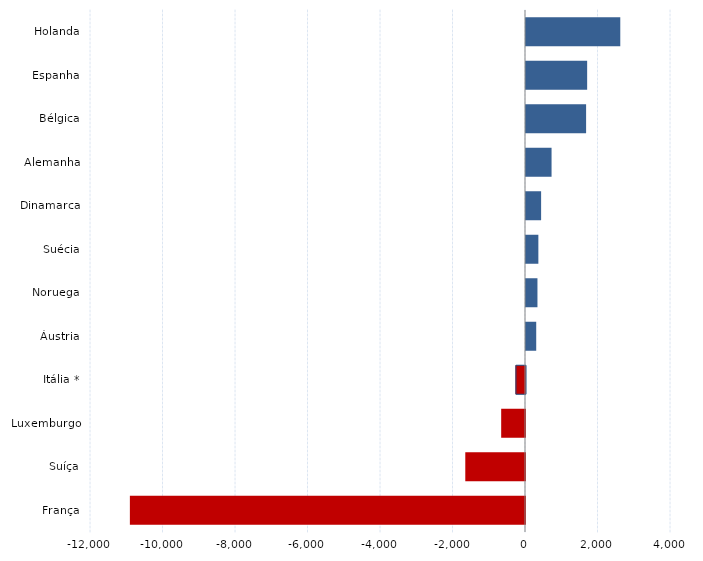
| Category | Series 0 |
|---|---|
| França | -10900 |
| Suíça | -1647 |
| Luxemburgo | -657 |
| Itália * | -264 |
| Áustria | 282 |
| Noruega | 316 |
| Suécia | 341 |
| Dinamarca | 417 |
| Alemanha | 705 |
| Bélgica | 1658 |
| Espanha | 1687 |
| Holanda | 2601 |